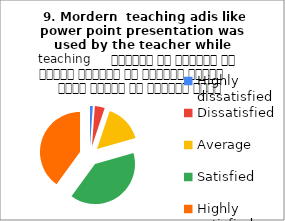
| Category |  9. Mordern  teaching adis like power point presentation was used by the teacher while teaching     शिक्षक ने शिक्षण के दौरान शिक्षण की आधुनिक तकनीक     पावर पॉइंट का प्रयोग किया |
|---|---|
| Highly dissatisfied | 2 |
| Dissatisfied | 7 |
| Average | 27 |
| Satisfied | 69 |
| Highly satisfied | 70 |